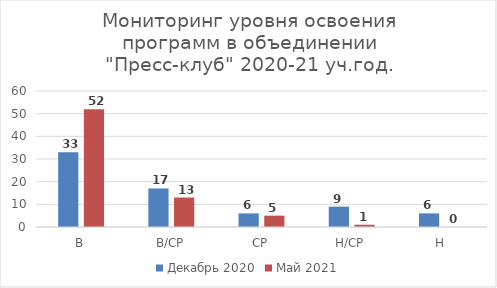
| Category | Декабрь 2020 | Май 2021 |
|---|---|---|
| В | 33 | 52 |
| В/СР | 17 | 13 |
| СР | 6 | 5 |
| Н/СР | 9 | 1 |
| Н | 6 | 0 |